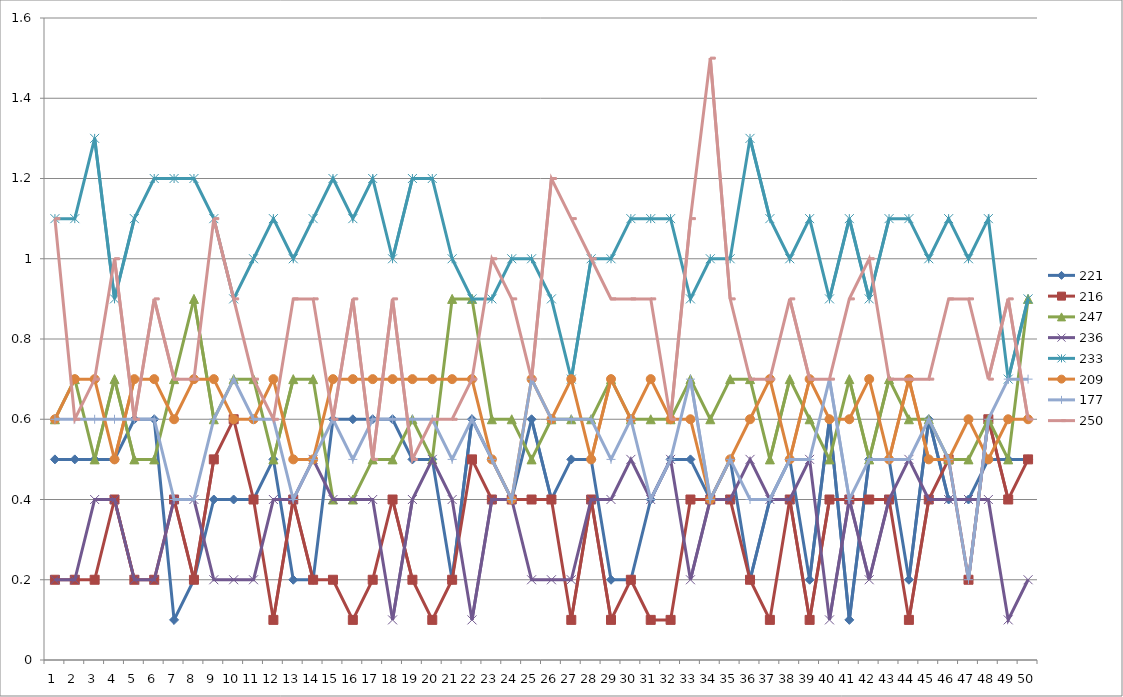
| Category | 221 | 216 | 247 | 236 | 233 | 209 | 177 | 250 |
|---|---|---|---|---|---|---|---|---|
| 0 | 0.5 | 0.2 | 0.6 | 0.2 | 1.1 | 0.6 | 0.6 | 1.1 |
| 1 | 0.5 | 0.2 | 0.7 | 0.2 | 1.1 | 0.7 | 0.6 | 0.6 |
| 2 | 0.5 | 0.2 | 0.5 | 0.4 | 1.3 | 0.7 | 0.6 | 0.7 |
| 3 | 0.5 | 0.4 | 0.7 | 0.4 | 0.9 | 0.5 | 0.6 | 1 |
| 4 | 0.6 | 0.2 | 0.5 | 0.2 | 1.1 | 0.7 | 0.6 | 0.6 |
| 5 | 0.6 | 0.2 | 0.5 | 0.2 | 1.2 | 0.7 | 0.6 | 0.9 |
| 6 | 0.1 | 0.4 | 0.7 | 0.4 | 1.2 | 0.6 | 0.4 | 0.7 |
| 7 | 0.2 | 0.2 | 0.9 | 0.4 | 1.2 | 0.7 | 0.4 | 0.7 |
| 8 | 0.4 | 0.5 | 0.6 | 0.2 | 1.1 | 0.7 | 0.6 | 1.1 |
| 9 | 0.4 | 0.6 | 0.7 | 0.2 | 0.9 | 0.6 | 0.7 | 0.9 |
| 10 | 0.4 | 0.4 | 0.7 | 0.2 | 1 | 0.6 | 0.6 | 0.7 |
| 11 | 0.5 | 0.1 | 0.5 | 0.4 | 1.1 | 0.7 | 0.6 | 0.6 |
| 12 | 0.2 | 0.4 | 0.7 | 0.4 | 1 | 0.5 | 0.4 | 0.9 |
| 13 | 0.2 | 0.2 | 0.7 | 0.5 | 1.1 | 0.5 | 0.5 | 0.9 |
| 14 | 0.6 | 0.2 | 0.4 | 0.4 | 1.2 | 0.7 | 0.6 | 0.6 |
| 15 | 0.6 | 0.1 | 0.4 | 0.4 | 1.1 | 0.7 | 0.5 | 0.9 |
| 16 | 0.6 | 0.2 | 0.5 | 0.4 | 1.2 | 0.7 | 0.6 | 0.5 |
| 17 | 0.6 | 0.4 | 0.5 | 0.1 | 1 | 0.7 | 0.6 | 0.9 |
| 18 | 0.5 | 0.2 | 0.6 | 0.4 | 1.2 | 0.7 | 0.6 | 0.5 |
| 19 | 0.5 | 0.1 | 0.5 | 0.5 | 1.2 | 0.7 | 0.6 | 0.6 |
| 20 | 0.2 | 0.2 | 0.9 | 0.4 | 1 | 0.7 | 0.5 | 0.6 |
| 21 | 0.6 | 0.5 | 0.9 | 0.1 | 0.9 | 0.7 | 0.6 | 0.7 |
| 22 | 0.5 | 0.4 | 0.6 | 0.4 | 0.9 | 0.5 | 0.5 | 1 |
| 23 | 0.4 | 0.4 | 0.6 | 0.4 | 1 | 0.4 | 0.4 | 0.9 |
| 24 | 0.6 | 0.4 | 0.5 | 0.2 | 1 | 0.7 | 0.7 | 0.7 |
| 25 | 0.4 | 0.4 | 0.6 | 0.2 | 0.9 | 0.6 | 0.6 | 1.2 |
| 26 | 0.5 | 0.1 | 0.6 | 0.2 | 0.7 | 0.7 | 0.6 | 1.1 |
| 27 | 0.5 | 0.4 | 0.6 | 0.4 | 1 | 0.5 | 0.6 | 1 |
| 28 | 0.2 | 0.1 | 0.7 | 0.4 | 1 | 0.7 | 0.5 | 0.9 |
| 29 | 0.2 | 0.2 | 0.6 | 0.5 | 1.1 | 0.6 | 0.6 | 0.9 |
| 30 | 0.4 | 0.1 | 0.6 | 0.4 | 1.1 | 0.7 | 0.4 | 0.9 |
| 31 | 0.5 | 0.1 | 0.6 | 0.5 | 1.1 | 0.6 | 0.5 | 0.6 |
| 32 | 0.5 | 0.4 | 0.7 | 0.2 | 0.9 | 0.6 | 0.7 | 1.1 |
| 33 | 0.4 | 0.4 | 0.6 | 0.4 | 1 | 0.4 | 0.4 | 1.5 |
| 34 | 0.5 | 0.4 | 0.7 | 0.4 | 1 | 0.5 | 0.5 | 0.9 |
| 35 | 0.2 | 0.2 | 0.7 | 0.5 | 1.3 | 0.6 | 0.4 | 0.7 |
| 36 | 0.4 | 0.1 | 0.5 | 0.4 | 1.1 | 0.7 | 0.4 | 0.7 |
| 37 | 0.5 | 0.4 | 0.7 | 0.4 | 1 | 0.5 | 0.5 | 0.9 |
| 38 | 0.2 | 0.1 | 0.6 | 0.5 | 1.1 | 0.7 | 0.5 | 0.7 |
| 39 | 0.6 | 0.4 | 0.5 | 0.1 | 0.9 | 0.6 | 0.7 | 0.7 |
| 40 | 0.1 | 0.4 | 0.7 | 0.4 | 1.1 | 0.6 | 0.4 | 0.9 |
| 41 | 0.5 | 0.4 | 0.5 | 0.2 | 0.9 | 0.7 | 0.5 | 1 |
| 42 | 0.5 | 0.4 | 0.7 | 0.4 | 1.1 | 0.5 | 0.5 | 0.7 |
| 43 | 0.2 | 0.1 | 0.6 | 0.5 | 1.1 | 0.7 | 0.5 | 0.7 |
| 44 | 0.6 | 0.4 | 0.6 | 0.4 | 1 | 0.5 | 0.6 | 0.7 |
| 45 | 0.4 | 0.5 | 0.5 | 0.4 | 1.1 | 0.5 | 0.5 | 0.9 |
| 46 | 0.4 | 0.2 | 0.5 | 0.4 | 1 | 0.6 | 0.2 | 0.9 |
| 47 | 0.5 | 0.6 | 0.6 | 0.4 | 1.1 | 0.5 | 0.6 | 0.7 |
| 48 | 0.5 | 0.4 | 0.5 | 0.1 | 0.7 | 0.6 | 0.7 | 0.9 |
| 49 | 0.5 | 0.5 | 0.9 | 0.2 | 0.9 | 0.6 | 0.7 | 0.6 |